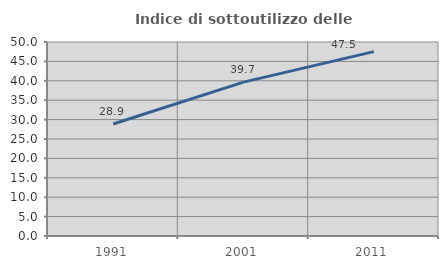
| Category | Indice di sottoutilizzo delle abitazioni  |
|---|---|
| 1991.0 | 28.855 |
| 2001.0 | 39.666 |
| 2011.0 | 47.51 |